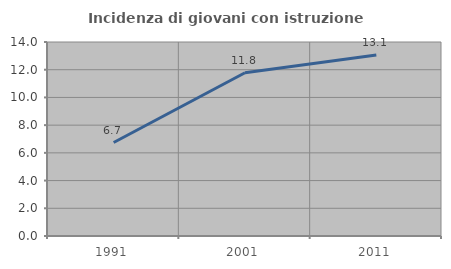
| Category | Incidenza di giovani con istruzione universitaria |
|---|---|
| 1991.0 | 6.745 |
| 2001.0 | 11.782 |
| 2011.0 | 13.063 |